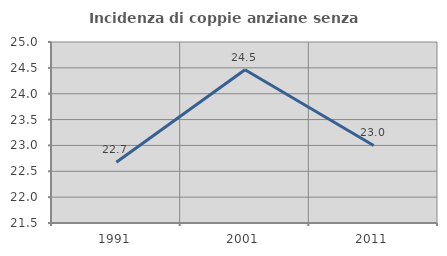
| Category | Incidenza di coppie anziane senza figli  |
|---|---|
| 1991.0 | 22.674 |
| 2001.0 | 24.465 |
| 2011.0 | 23 |